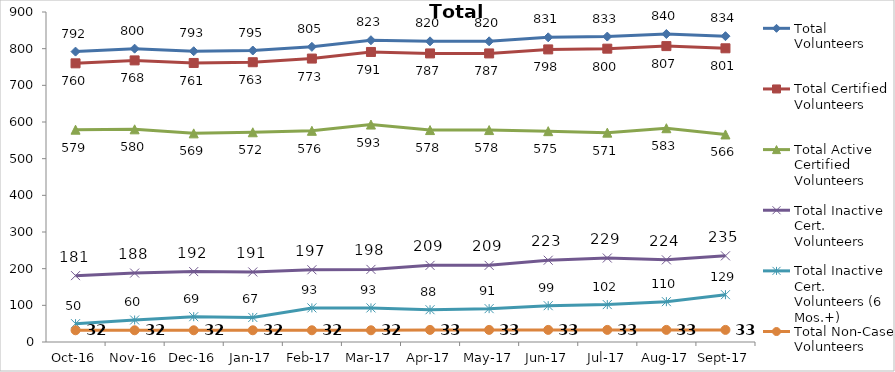
| Category | Total Volunteers | Total Certified Volunteers | Total Active Certified Volunteers | Total Inactive Cert. Volunteers | Total Inactive Cert. Volunteers (6 Mos.+) | Total Non-Case Volunteers |
|---|---|---|---|---|---|---|
| 2016-10-01 | 792 | 760 | 579 | 181 | 50 | 32 |
| 2016-11-01 | 800 | 768 | 580 | 188 | 60 | 32 |
| 2016-12-01 | 793 | 761 | 569 | 192 | 69 | 32 |
| 2017-01-01 | 795 | 763 | 572 | 191 | 67 | 32 |
| 2017-02-01 | 805 | 773 | 576 | 197 | 93 | 32 |
| 2017-03-01 | 823 | 791 | 593 | 198 | 93 | 32 |
| 2017-04-01 | 820 | 787 | 578 | 209 | 88 | 33 |
| 2017-05-01 | 820 | 787 | 578 | 209 | 91 | 33 |
| 2017-06-01 | 831 | 798 | 575 | 223 | 99 | 33 |
| 2017-07-01 | 833 | 800 | 571 | 229 | 102 | 33 |
| 2017-08-01 | 840 | 807 | 583 | 224 | 110 | 33 |
| 2017-09-01 | 834 | 801 | 566 | 235 | 129 | 33 |